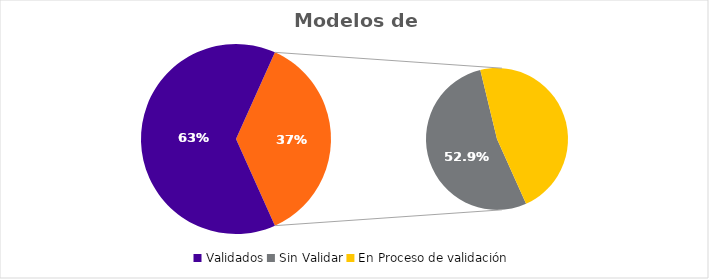
| Category | Series 0 |
|---|---|
| Validados | 118 |
| Sin Validar | 36 |
| En Proceso de validación | 32 |